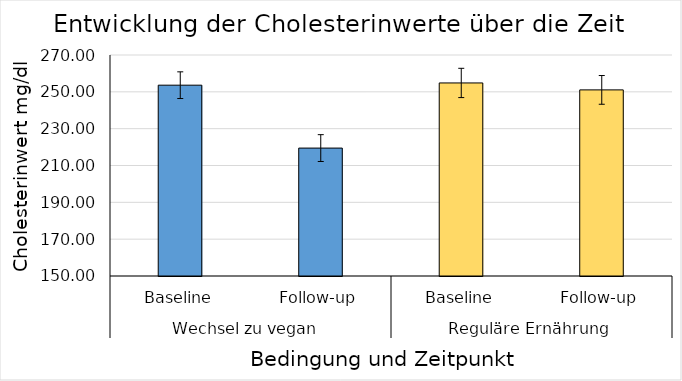
| Category | Series 0 |
|---|---|
| 0 | 253.616 |
| 1 | 219.459 |
| 2 | 254.823 |
| 3 | 251.057 |